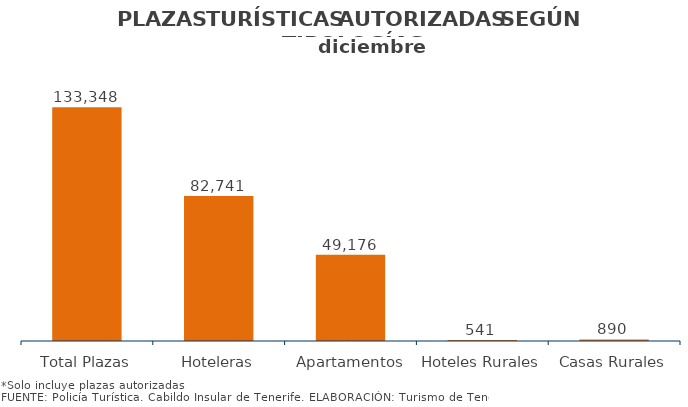
| Category | PLAZAS TURISTICAS AUTORIZADAS SEGÚN TIPOLOGÍA DEL ESTABLECIMIENTO.
Municipios e Isla diciembre 2014 |
|---|---|
| Total Plazas | 133348 |
| Hoteleras | 82741 |
| Apartamentos | 49176 |
| Hoteles Rurales | 541 |
| Casas Rurales | 890 |